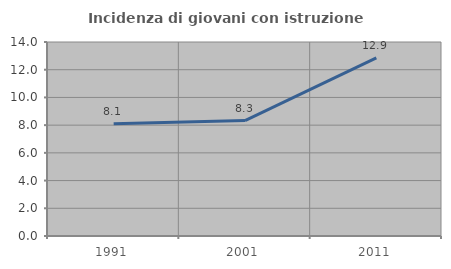
| Category | Incidenza di giovani con istruzione universitaria |
|---|---|
| 1991.0 | 8.108 |
| 2001.0 | 8.333 |
| 2011.0 | 12.857 |